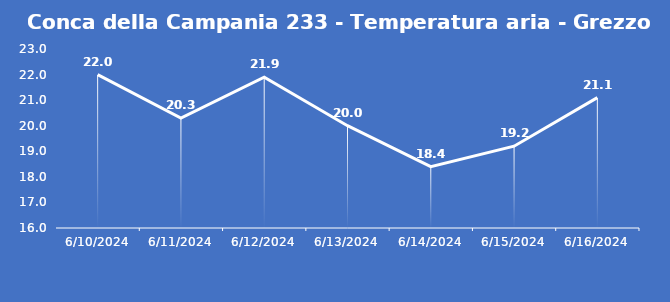
| Category | Conca della Campania 233 - Temperatura aria - Grezzo (°C) |
|---|---|
| 6/10/24 | 22 |
| 6/11/24 | 20.3 |
| 6/12/24 | 21.9 |
| 6/13/24 | 20 |
| 6/14/24 | 18.4 |
| 6/15/24 | 19.2 |
| 6/16/24 | 21.1 |